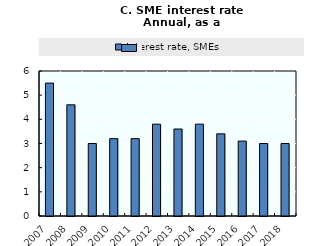
| Category | Interest rate, SMEs |
|---|---|
| 2007.0 | 5.5 |
| 2008.0 | 4.6 |
| 2009.0 | 3 |
| 2010.0 | 3.2 |
| 2011.0 | 3.2 |
| 2012.0 | 3.8 |
| 2013.0 | 3.6 |
| 2014.0 | 3.8 |
| 2015.0 | 3.4 |
| 2016.0 | 3.1 |
| 2017.0 | 3 |
| 2018.0 | 3 |